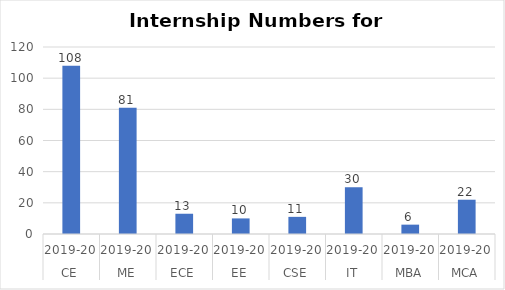
| Category | Internship Numbers |
|---|---|
| 0 | 108 |
| 1 | 81 |
| 2 | 13 |
| 3 | 10 |
| 4 | 11 |
| 5 | 30 |
| 6 | 6 |
| 7 | 22 |